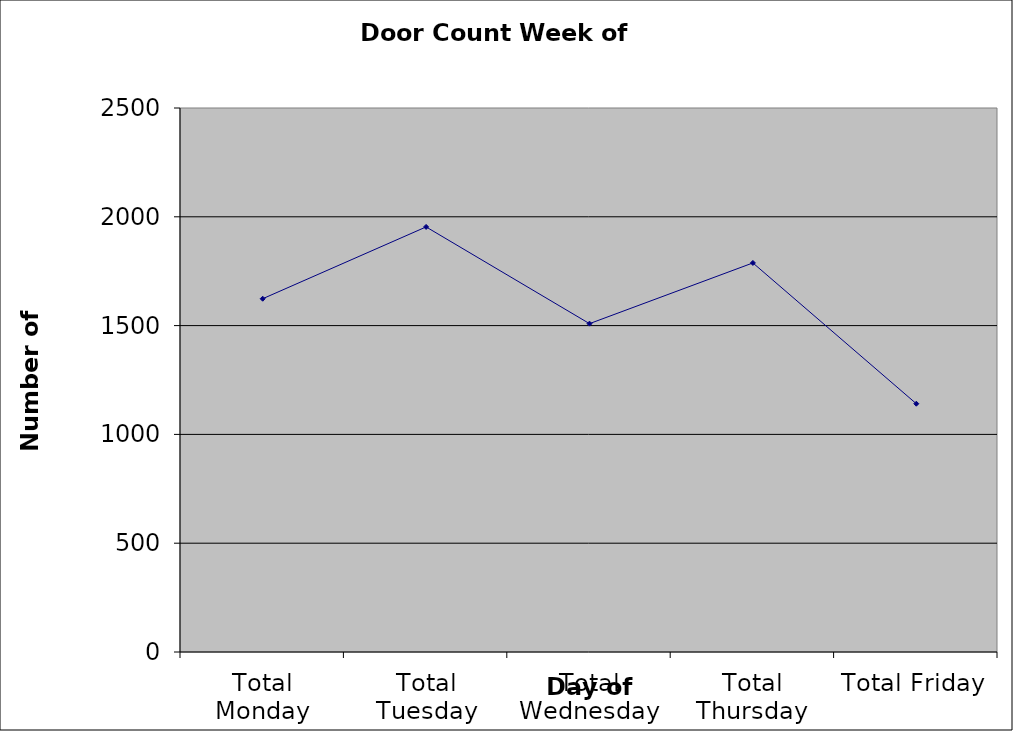
| Category | Series 0 |
|---|---|
| Total Monday | 1623.5 |
| Total Tuesday | 1953.5 |
| Total Wednesday | 1509 |
| Total Thursday | 1788 |
| Total Friday | 1141 |